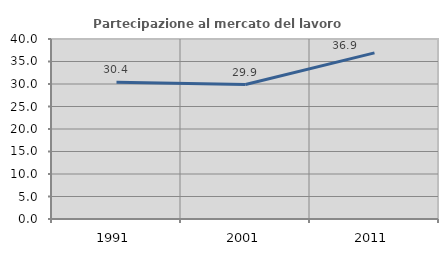
| Category | Partecipazione al mercato del lavoro  femminile |
|---|---|
| 1991.0 | 30.409 |
| 2001.0 | 29.877 |
| 2011.0 | 36.92 |